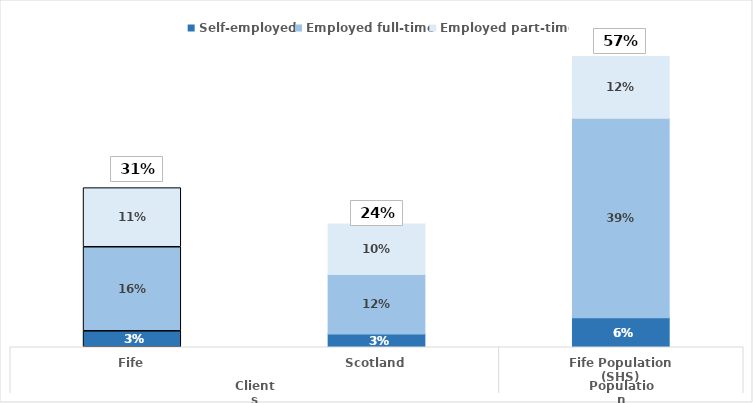
| Category | Self-employed | Employed full-time | Employed part-time |
|---|---|---|---|
| 0 | 0.031 | 0.163 | 0.115 |
| 1 | 0.026 | 0.116 | 0.098 |
| 2 | 0.058 | 0.387 | 0.12 |